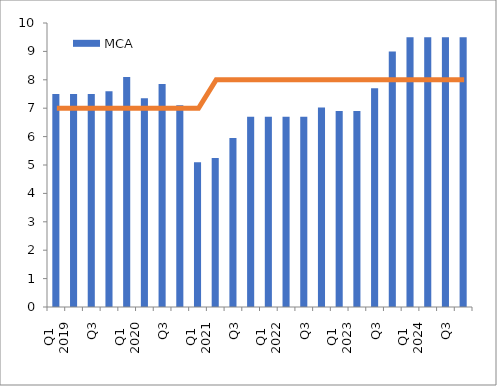
| Category | MCA |
|---|---|
| 0 | 7.5 |
| 1 | 7.5 |
| 2 | 7.5 |
| 3 | 7.6 |
| 4 | 8.1 |
| 5 | 7.35 |
| 6 | 7.85 |
| 7 | 7.1 |
| 8 | 5.1 |
| 9 | 5.25 |
| 10 | 5.95 |
| 11 | 6.7 |
| 12 | 6.7 |
| 13 | 6.7 |
| 14 | 6.7 |
| 15 | 7.025 |
| 16 | 6.9 |
| 17 | 6.9 |
| 18 | 7.7 |
| 19 | 9 |
| 20 | 9.5 |
| 21 | 9.5 |
| 22 | 9.5 |
| 23 | 9.5 |